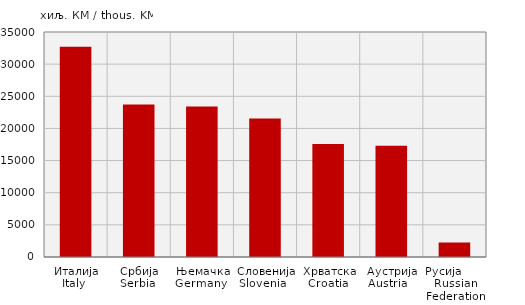
| Category | Извоз
Export |
|---|---|
| Италија
Italy  | 32687 |
| Србија
Serbia  | 23709 |
| Њемачка
Germany  | 23400 |
| Словенија
Slovenia   | 21535 |
| Хрватска
Croatia  | 17573 |
| Аустрија
Austria    | 17294 |
| Русија        Russian Federation | 2251 |